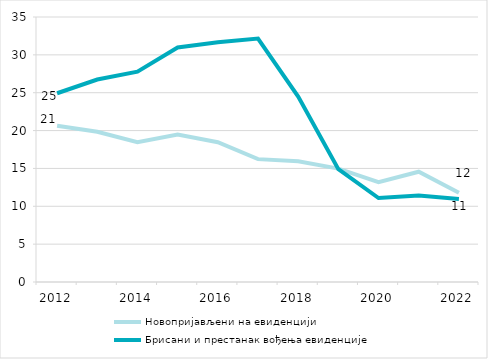
| Category | Новопријављени на евиденцији | Брисани и престанак вођења евиденције |
|---|---|---|
| 2012.0 | 20.629 | 24.928 |
| 2013.0 | 19.833 | 26.742 |
| 2014.0 | 18.475 | 27.788 |
| 2015.0 | 19.468 | 30.98 |
| 2016.0 | 18.469 | 31.67 |
| 2017.0 | 16.227 | 32.158 |
| 2018.0 | 15.939 | 24.483 |
| 2019.0 | 14.973 | 14.898 |
| 2020.0 | 13.18 | 11.087 |
| 2021.0 | 14.564 | 11.432 |
| 2022.0 | 11.785 | 10.954 |